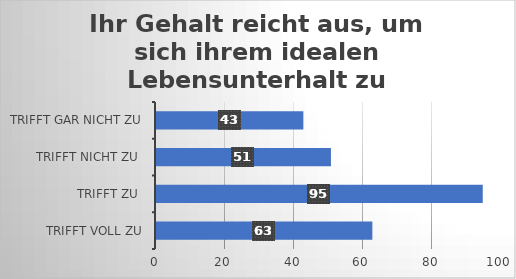
| Category | Ihr Gehalt reicht aus, um sich ihrem idealen Lebensunterhalt zu finanzieren.  |
|---|---|
| trifft voll zu | 63 |
| trifft zu  | 95 |
| trifft nicht zu  | 51 |
| trifft gar nicht zu | 43 |